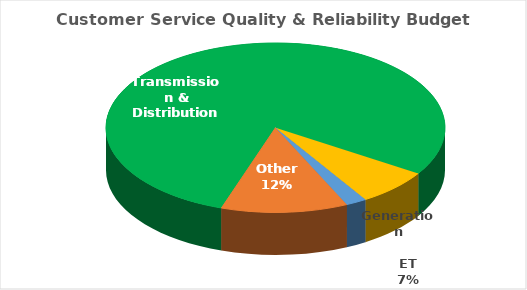
| Category | Series 0 |
|---|---|
| Generation | 3055000 |
| Other | 18525000 |
| Transmission & Distribution | 121149782 |
| ET | 10800000 |